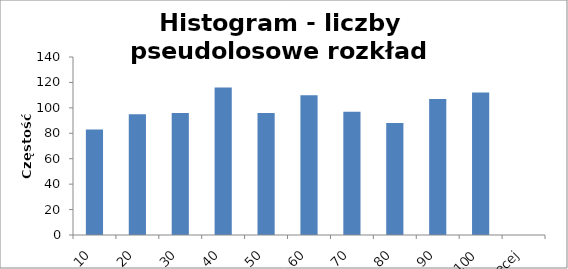
| Category | Częstość |
|---|---|
| 10 | 83 |
| 20 | 95 |
| 30 | 96 |
| 40 | 116 |
| 50 | 96 |
| 60 | 110 |
| 70 | 97 |
| 80 | 88 |
| 90 | 107 |
| 100 | 112 |
| Więcej | 0 |